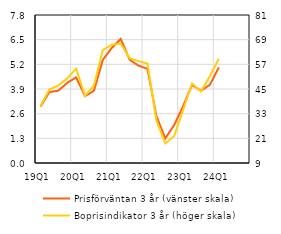
| Category | Prisförväntan 3 år (vänster skala) |
|---|---|
| 19Q1 | 2.974 |
| 19Q2 | 3.739 |
| 19Q3 | 3.812 |
| 19Q4 | 4.224 |
| 20Q1 | 4.51 |
| 20Q2 | 3.522 |
| 20Q3 | 3.812 |
| 20Q4 | 5.439 |
| 21Q1 | 6.071 |
| 21Q2 | 6.539 |
| 21Q3 | 5.448 |
| 21Q4 | 5.131 |
| 22Q1 | 4.962 |
| 22Q2 | 2.478 |
| 22Q3 | 1.293 |
| 22Q4 | 2.004 |
| 23Q1 | 2.998 |
| 23Q2 | 4.114 |
| 23Q3 | 3.807 |
| 23Q4 | 4.121 |
| 24Q1 | 5.037 |